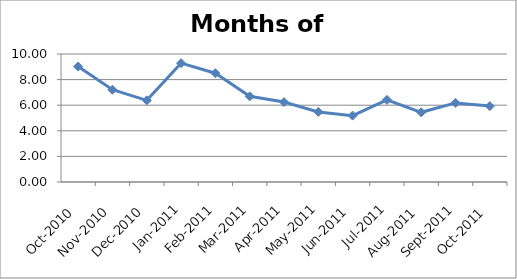
| Category | Series 0 |
|---|---|
| 2010-10-01 | 9.022 |
| 2010-11-01 | 7.207 |
| 2010-12-01 | 6.379 |
| 2011-01-01 | 9.284 |
| 2011-02-01 | 8.5 |
| 2011-03-01 | 6.692 |
| 2011-04-01 | 6.244 |
| 2011-05-01 | 5.474 |
| 2011-06-01 | 5.186 |
| 2011-07-01 | 6.415 |
| 2011-08-01 | 5.444 |
| 2011-09-01 | 6.179 |
| 2011-10-01 | 5.93 |